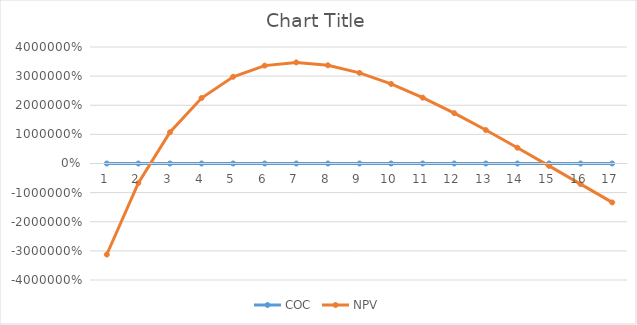
| Category | COC | NPV |
|---|---|---|
| 0 | 0 | -31250 |
| 1 | 0.02 | -6679.102 |
| 2 | 0.04 | 10726.118 |
| 3 | 0.06 | 22478.121 |
| 4 | 0.08 | 29783.03 |
| 5 | 0.1 | 33604.063 |
| 6 | 0.12 | 34711.278 |
| 7 | 0.14 | 33720.732 |
| 8 | 0.16 | 31125.411 |
| 9 | 0.18 | 27319.73 |
| 10 | 0.2 | 22619.009 |
| 11 | 0.22 | 17274.989 |
| 12 | 0.24 | 11488.234 |
| 13 | 0.26 | 5418.064 |
| 14 | 0.28 | -809.467 |
| 15 | 0.3 | -7095.158 |
| 16 | 0.32 | -13361.482 |